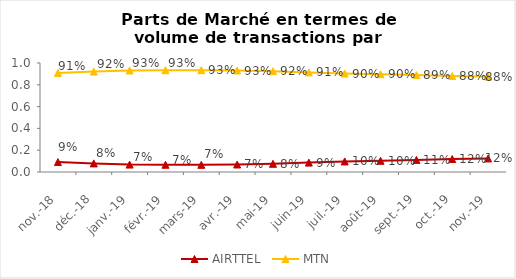
| Category | AIRTTEL | MTN |
|---|---|---|
| 2018-11-01 | 0.091 | 0.909 |
| 2018-12-01 | 0.079 | 0.921 |
| 2019-01-01 | 0.068 | 0.932 |
| 2019-02-01 | 0.067 | 0.933 |
| 2019-03-01 | 0.066 | 0.934 |
| 2019-04-01 | 0.069 | 0.931 |
| 2019-05-01 | 0.075 | 0.925 |
| 2019-06-01 | 0.086 | 0.914 |
| 2019-07-01 | 0.097 | 0.903 |
| 2019-08-01 | 0.103 | 0.897 |
| 2019-09-01 | 0.111 | 0.889 |
| 2019-10-01 | 0.119 | 0.881 |
| 2019-11-01 | 0.124 | 0.876 |